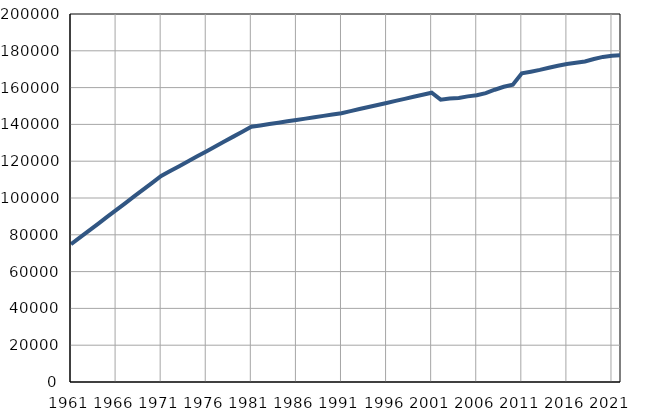
| Category | Population
size |
|---|---|
| 1961.0 | 74851 |
| 1962.0 | 78563 |
| 1963.0 | 82275 |
| 1964.0 | 85985 |
| 1965.0 | 89697 |
| 1966.0 | 93409 |
| 1967.0 | 97121 |
| 1968.0 | 100833 |
| 1969.0 | 104543 |
| 1970.0 | 108255 |
| 1971.0 | 111967 |
| 1972.0 | 114641 |
| 1973.0 | 117314 |
| 1974.0 | 119987 |
| 1975.0 | 122661 |
| 1976.0 | 125335 |
| 1977.0 | 128008 |
| 1978.0 | 130682 |
| 1979.0 | 133355 |
| 1980.0 | 136028 |
| 1981.0 | 138702 |
| 1982.0 | 139442 |
| 1983.0 | 140181 |
| 1984.0 | 140922 |
| 1985.0 | 141662 |
| 1986.0 | 142402 |
| 1987.0 | 143141 |
| 1988.0 | 143881 |
| 1989.0 | 144622 |
| 1990.0 | 145361 |
| 1991.0 | 146101 |
| 1992.0 | 147215 |
| 1993.0 | 148329 |
| 1994.0 | 149442 |
| 1995.0 | 150556 |
| 1996.0 | 151670 |
| 1997.0 | 152785 |
| 1998.0 | 153899 |
| 1999.0 | 155013 |
| 2000.0 | 156126 |
| 2001.0 | 157240 |
| 2002.0 | 153464 |
| 2003.0 | 154129 |
| 2004.0 | 154396 |
| 2005.0 | 155222 |
| 2006.0 | 155881 |
| 2007.0 | 157021 |
| 2008.0 | 158845 |
| 2009.0 | 160442 |
| 2010.0 | 161531 |
| 2011.0 | 167749 |
| 2012.0 | 168643 |
| 2013.0 | 169632 |
| 2014.0 | 170793 |
| 2015.0 | 171861 |
| 2016.0 | 172803 |
| 2017.0 | 173460 |
| 2018.0 | 174197 |
| 2019.0 | 175550 |
| 2020.0 | 176683 |
| 2021.0 | 177263 |
| 2022.0 | 177657 |